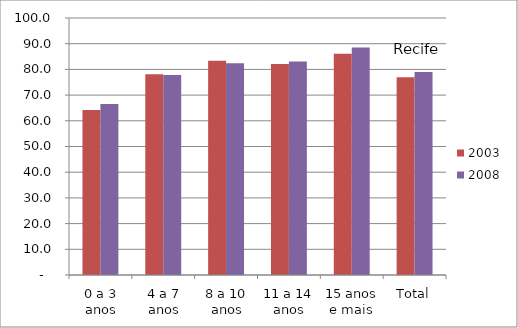
| Category | 2003 | 2008 |
|---|---|---|
| 0 a 3 anos | 64.19 | 66.54 |
| 4 a 7 anos | 78.15 | 77.84 |
| 8 a 10 anos | 83.34 | 82.38 |
| 11 a 14 anos | 82.08 | 83.11 |
| 15 anos e mais | 86.13 | 88.52 |
| Total | 76.91 | 78.99 |